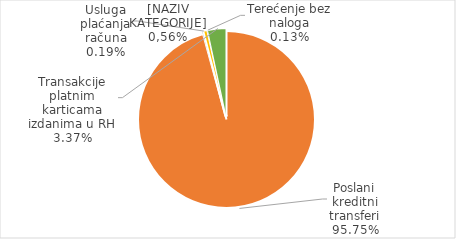
| Category | Ukupno | Series 1 |
|---|---|---|
|  | 0 |  |
| Poslani kreditni transferi | 2317170691180 |  |
| Usluga plaćanja računa | 4561468089 |  |
| Izravno terećenje | 13741833881 |  |
| Terećenje bez naloga | 3089640346 |  |
| Transakcije platnim karticama izdanima u RH | 81494909617 |  |